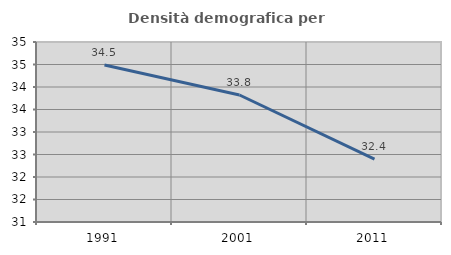
| Category | Densità demografica |
|---|---|
| 1991.0 | 34.488 |
| 2001.0 | 33.823 |
| 2011.0 | 32.398 |